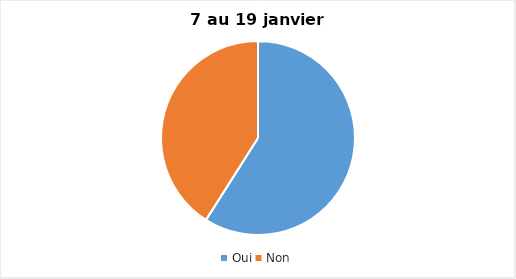
| Category | Series 0 |
|---|---|
| Oui | 59 |
| Non | 41 |